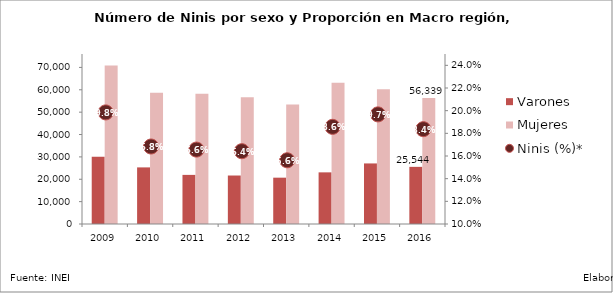
| Category | Varones | Mujeres |
|---|---|---|
| 2009.0 | 30021.59 | 70808.55 |
| 2010.0 | 25307.03 | 58682.63 |
| 2011.0 | 21956.04 | 58195.95 |
| 2012.0 | 21677.059 | 56657.634 |
| 2013.0 | 20711.74 | 53385.67 |
| 2014.0 | 23087.41 | 63095.06 |
| 2015.0 | 27077.66 | 60232.91 |
| 2016.0 | 25544.182 | 56339.326 |